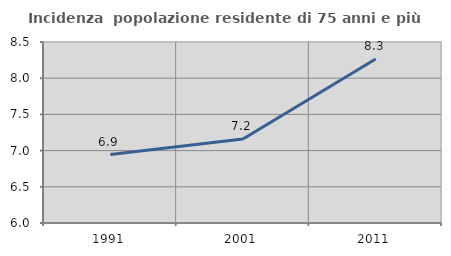
| Category | Incidenza  popolazione residente di 75 anni e più |
|---|---|
| 1991.0 | 6.946 |
| 2001.0 | 7.159 |
| 2011.0 | 8.265 |